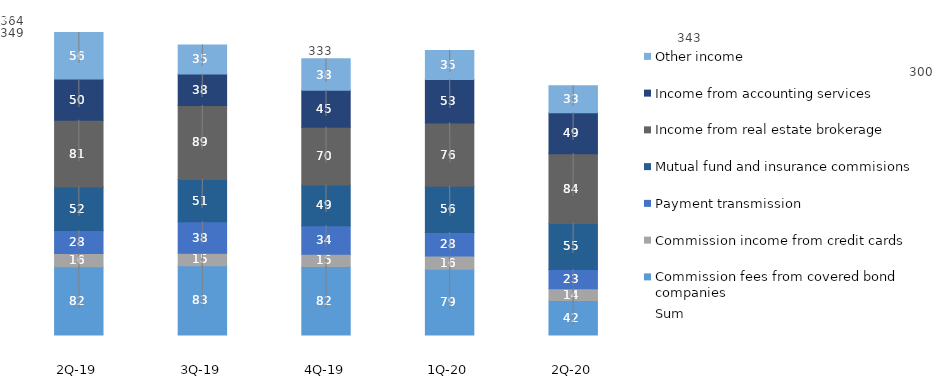
| Category | Commission fees from covered bond companies | Commission income from credit cards | Payment transmission | Mutual fund and insurance commisions | Income from real estate brokerage | Income from accounting services | Other income |
|---|---|---|---|---|---|---|---|
| 2Q-20 | 41.55 | 14.097 | 23.262 | 55.386 | 84.016 | 49.478 | 32.501 |
| 1Q-20 | 78.983 | 16.14 | 28.326 | 55.562 | 76.287 | 52.513 | 34.973 |
| 4Q-19 | 82.3 | 14.8 | 34.4 | 49.1 | 69.7 | 44.5 | 37.8 |
| 3Q-19 | 83.345 | 15 | 38 | 51 | 89 | 38 | 35 |
| 2Q-19 | 82.097 | 16.08 | 27.71 | 52.19 | 80.63 | 49.6 | 56.1 |